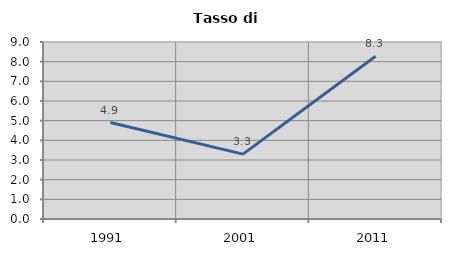
| Category | Tasso di disoccupazione   |
|---|---|
| 1991.0 | 4.905 |
| 2001.0 | 3.301 |
| 2011.0 | 8.275 |